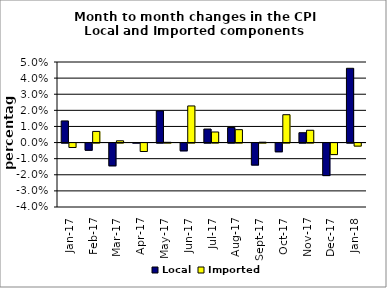
| Category | Local | Imported |
|---|---|---|
| 2017-01-01 | 0.013 | -0.003 |
| 2017-02-01 | -0.004 | 0.007 |
| 2017-03-01 | -0.014 | 0.001 |
| 2017-04-01 | 0 | -0.005 |
| 2017-05-01 | 0.02 | 0 |
| 2017-06-01 | -0.005 | 0.023 |
| 2017-07-01 | 0.008 | 0.007 |
| 2017-08-01 | 0.009 | 0.008 |
| 2017-09-01 | -0.014 | 0 |
| 2017-10-01 | -0.005 | 0.017 |
| 2017-11-01 | 0.006 | 0.008 |
| 2017-12-01 | -0.02 | -0.007 |
| 2018-01-01 | 0.046 | -0.002 |